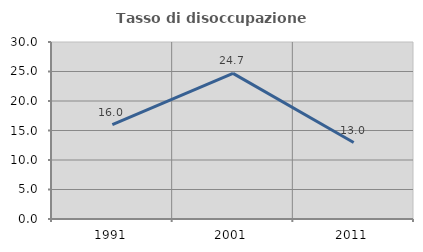
| Category | Tasso di disoccupazione giovanile  |
|---|---|
| 1991.0 | 16 |
| 2001.0 | 24.675 |
| 2011.0 | 12.963 |